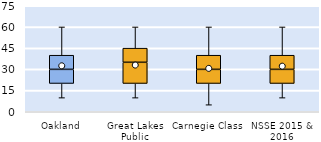
| Category | 25th | 50th | 75th |
|---|---|---|---|
| Oakland | 20 | 10 | 10 |
| Great Lakes Public | 20 | 15 | 10 |
| Carnegie Class | 20 | 10 | 10 |
| NSSE 2015 & 2016 | 20 | 10 | 10 |